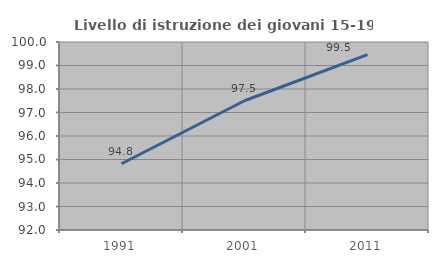
| Category | Livello di istruzione dei giovani 15-19 anni |
|---|---|
| 1991.0 | 94.821 |
| 2001.0 | 97.5 |
| 2011.0 | 99.462 |